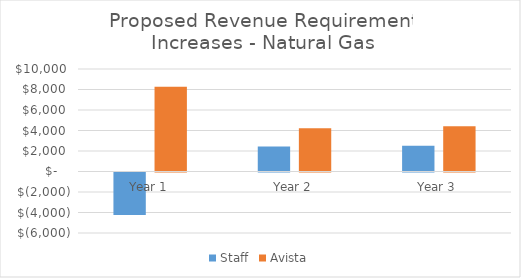
| Category | Staff | Avista |
|---|---|---|
| Year 1 | -4134.842 | 8269 |
| Year 2 | 2446.05 | 4220 |
| Year 3 | 2524.291 | 4417 |